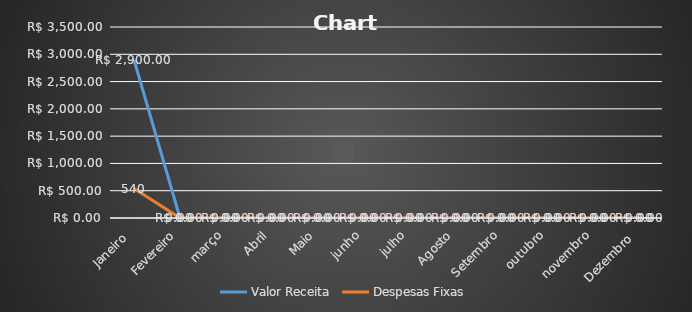
| Category | Valor Receita | Despesas Fixas |
|---|---|---|
| Janeiro  | 2900 | 540 |
| Fevereiro | 0 | 0 |
| março | 0 | 0 |
| Abril | 0 | 0 |
| Maio | 0 | 0 |
| junho | 0 | 0 |
| julho | 0 | 0 |
| Agosto | 0 | 0 |
| Setembro | 0 | 0 |
| outubro | 0 | 0 |
| novembro | 0 | 0 |
| Dezembro  | 0 | 0 |